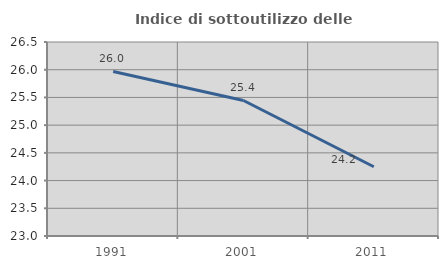
| Category | Indice di sottoutilizzo delle abitazioni  |
|---|---|
| 1991.0 | 25.969 |
| 2001.0 | 25.445 |
| 2011.0 | 24.249 |